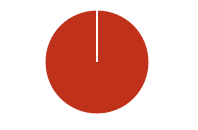
| Category | Total |
|---|---|
| Y | 0 |
| R | 0 |
| T | 0 |
| M | 0 |
| F | 0 |
| N | 304 |